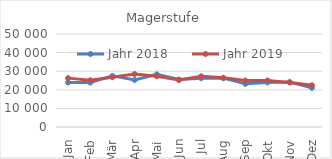
| Category | Jahr 2018 | Jahr 2019 |
|---|---|---|
| 0 | 23918.654 | 26275.201 |
| 1 | 23872.662 | 25098.611 |
| 2 | 27488.71 | 26741.341 |
| 3 | 25296.685 | 28460.509 |
| 4 | 28303.011 | 27270.385 |
| 5 | 25533.54 | 25241.874 |
| 6 | 26230.388 | 27256.988 |
| 7 | 26253.84 | 26448.356 |
| 8 | 23209.623 | 24954.597 |
| 9 | 23964.652 | 25033.472 |
| 10 | 24179.703 | 23876.144 |
| 11 | 21058.342 | 22422.992 |